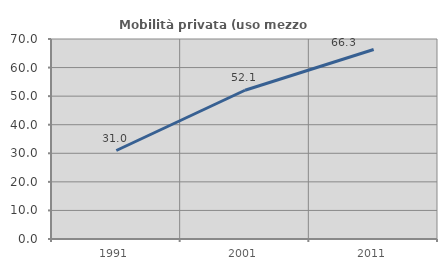
| Category | Mobilità privata (uso mezzo privato) |
|---|---|
| 1991.0 | 30.974 |
| 2001.0 | 52.061 |
| 2011.0 | 66.337 |